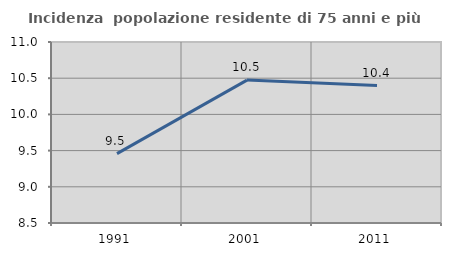
| Category | Incidenza  popolazione residente di 75 anni e più |
|---|---|
| 1991.0 | 9.458 |
| 2001.0 | 10.474 |
| 2011.0 | 10.399 |